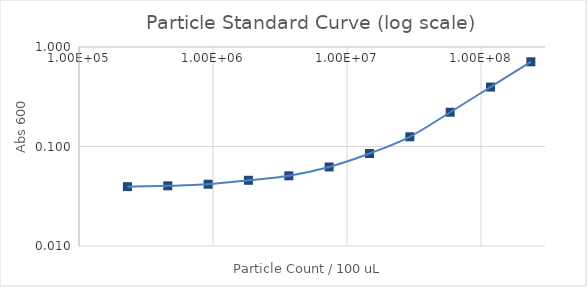
| Category | Series 1 |
|---|---|
| 235294117.64705887 | 0.71 |
| 117647058.82352944 | 0.396 |
| 58823529.41176472 | 0.221 |
| 29411764.70588236 | 0.125 |
| 14705882.35294118 | 0.085 |
| 7352941.17647059 | 0.062 |
| 3676470.588235295 | 0.051 |
| 1838235.2941176475 | 0.046 |
| 919117.6470588237 | 0.042 |
| 459558.82352941186 | 0.04 |
| 229779.41176470593 | 0.04 |